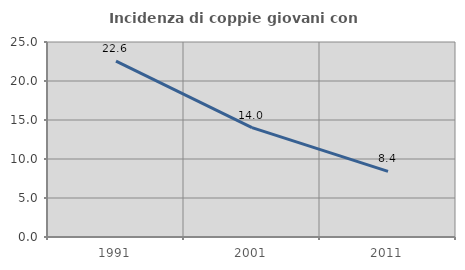
| Category | Incidenza di coppie giovani con figli |
|---|---|
| 1991.0 | 22.556 |
| 2001.0 | 14.014 |
| 2011.0 | 8.41 |